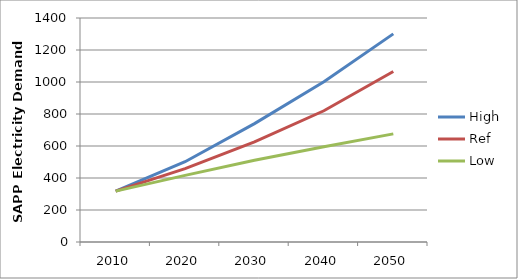
| Category | High | Ref | Low |
|---|---|---|---|
| 2010.0 | 318.12 | 318.12 | 318.12 |
| 2020.0 | 501.761 | 458.852 | 416.456 |
| 2030.0 | 740.057 | 625.156 | 510.826 |
| 2040.0 | 1001.464 | 820.2 | 595.341 |
| 2050.0 | 1300.775 | 1065.336 | 675.894 |